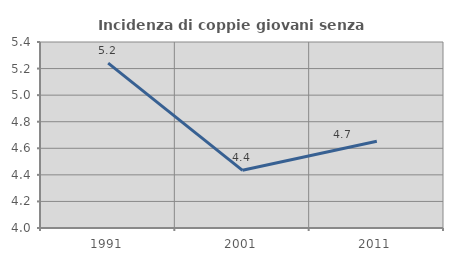
| Category | Incidenza di coppie giovani senza figli |
|---|---|
| 1991.0 | 5.24 |
| 2001.0 | 4.434 |
| 2011.0 | 4.653 |